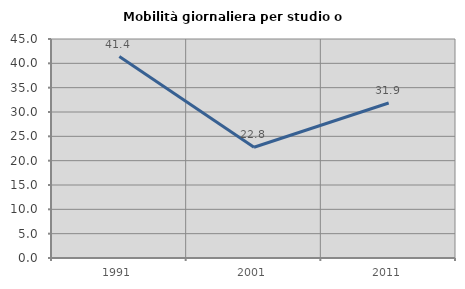
| Category | Mobilità giornaliera per studio o lavoro |
|---|---|
| 1991.0 | 41.395 |
| 2001.0 | 22.764 |
| 2011.0 | 31.858 |